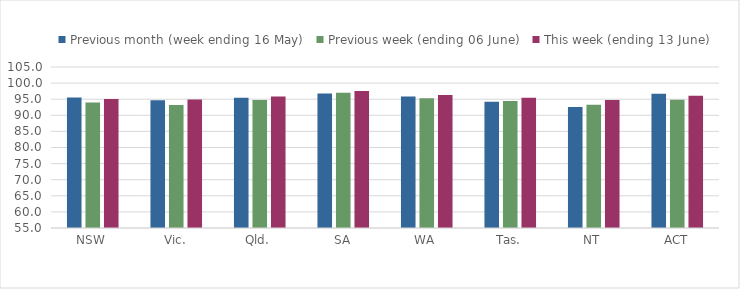
| Category | Previous month (week ending 16 May) | Previous week (ending 06 June) | This week (ending 13 June) |
|---|---|---|---|
| NSW | 95.522 | 93.946 | 95.042 |
| Vic. | 94.683 | 93.18 | 94.943 |
| Qld. | 95.463 | 94.735 | 95.825 |
| SA | 96.784 | 97.031 | 97.508 |
| WA | 95.815 | 95.297 | 96.296 |
| Tas. | 94.204 | 94.45 | 95.441 |
| NT | 92.567 | 93.306 | 94.753 |
| ACT | 96.711 | 94.793 | 96.079 |